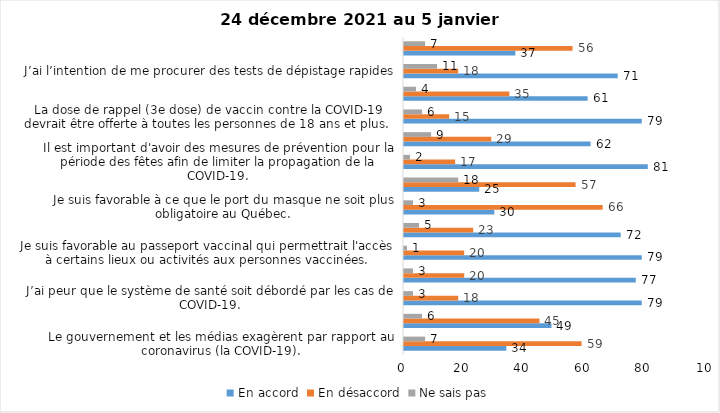
| Category | En accord | En désaccord | Ne sais pas |
|---|---|---|---|
| Le gouvernement et les médias exagèrent par rapport au coronavirus (la COVID-19). | 34 | 59 | 7 |
| Je suis favorable à la mise en place d’un couvre-feu. | 49 | 45 | 6 |
| J’ai peur que le système de santé soit débordé par les cas de COVID-19. | 79 | 18 | 3 |
| Je suis inquiet/inquiète que le nombre de cas augmente en raison des nouveaux variants du virus de la COVID-19. | 77 | 20 | 3 |
| Je suis favorable au passeport vaccinal qui permettrait l'accès à certains lieux ou activités aux personnes vaccinées. | 79 | 20 | 1 |
| Je suis confiant que la vaccination protège efficacement contre les variants de la COVID-19 | 72 | 23 | 5 |
| Je suis favorable à ce que le port du masque ne soit plus obligatoire au Québec. | 30 | 66 | 3 |
| La vaccination des enfants entre 5 et 11 ans mettra fin à la pandémie. | 25 | 57 | 18 |
| Il est important d'avoir des mesures de prévention pour la période des fêtes afin de limiter la propagation de la COVID-19. | 81 | 17 | 2 |
| La pandémie ne sera pas terminée au Québec avant que tous les habitants de la terre puissent être vaccinés contre la COVID-19.   | 62 | 29 | 9 |
| La dose de rappel (3e dose) de vaccin contre la COVID-19 devrait être offerte à toutes les personnes de 18 ans et plus.  | 79 | 15 | 6 |
| Je suis inconfortable d’être en contact avec une personne non vaccinée contre la COVID-19 | 61 | 35 | 4 |
| J’ai l’intention de me procurer des tests de dépistage rapides | 71 | 18 | 11 |
| Je n'ai pas peur du variant Omicron, car il semble moins dangereux pour la santé. | 37 | 56 | 7 |